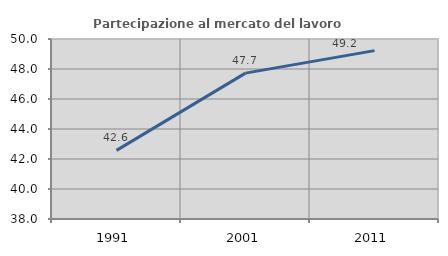
| Category | Partecipazione al mercato del lavoro  femminile |
|---|---|
| 1991.0 | 42.575 |
| 2001.0 | 47.725 |
| 2011.0 | 49.226 |